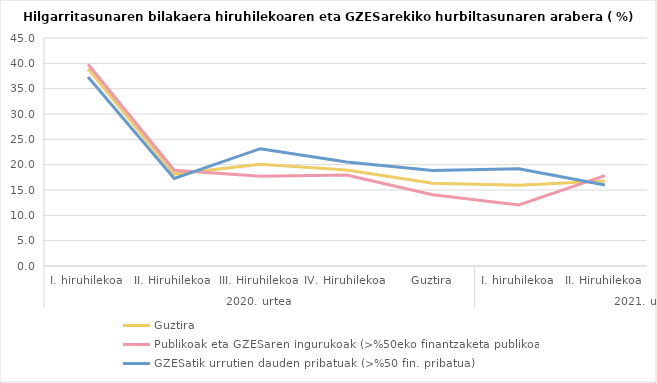
| Category | Guztira | Publikoak eta GZESaren ingurukoak (>%50eko finantzaketa publikoa) | GZESatik urrutien dauden pribatuak (>%50 fin. pribatua) |
|---|---|---|---|
| 0 | 38.926 | 39.832 | 37.313 |
| 1 | 18.149 | 18.904 | 17.266 |
| 2 | 20.066 | 17.726 | 23.155 |
| 3 | 18.94 | 17.943 | 20.536 |
| 4 | 16.353 | 14.068 | 18.841 |
| 5 | 15.934 | 12.048 | 19.192 |
| 6 | 16.771 | 17.822 | 16 |